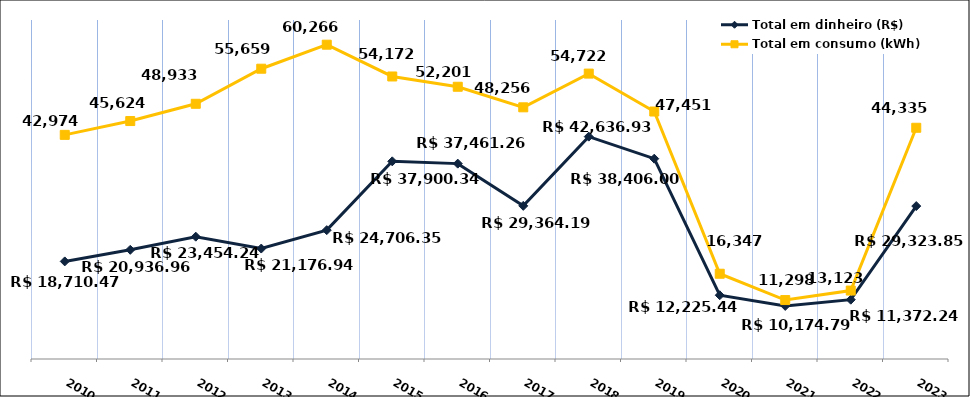
| Category | Total em dinheiro (R$) |
|---|---|
| 2010.0 | 18710.47 |
| 2011.0 | 20936.96 |
| 2012.0 | 23454.24 |
| 2013.0 | 21176.94 |
| 2014.0 | 24706.35 |
| 2015.0 | 37900.34 |
| 2016.0 | 37461.26 |
| 2017.0 | 29364.19 |
| 2018.0 | 42636.93 |
| 2019.0 | 38406 |
| 2020.0 | 12225.44 |
| 2021.0 | 10174.79 |
| 2022.0 | 11372.24 |
| 2023.0 | 29323.85 |